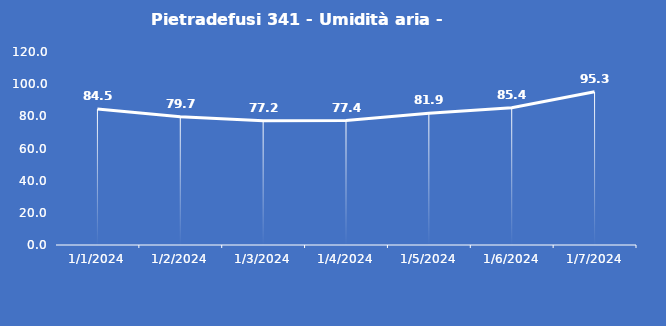
| Category | Pietradefusi 341 - Umidità aria - Grezzo (%) |
|---|---|
| 1/1/24 | 84.5 |
| 1/2/24 | 79.7 |
| 1/3/24 | 77.2 |
| 1/4/24 | 77.4 |
| 1/5/24 | 81.9 |
| 1/6/24 | 85.4 |
| 1/7/24 | 95.3 |